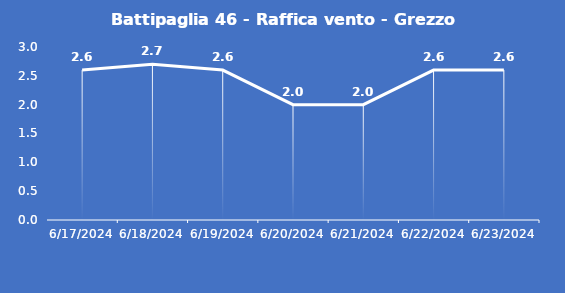
| Category | Battipaglia 46 - Raffica vento - Grezzo (m/s) |
|---|---|
| 6/17/24 | 2.6 |
| 6/18/24 | 2.7 |
| 6/19/24 | 2.6 |
| 6/20/24 | 2 |
| 6/21/24 | 2 |
| 6/22/24 | 2.6 |
| 6/23/24 | 2.6 |